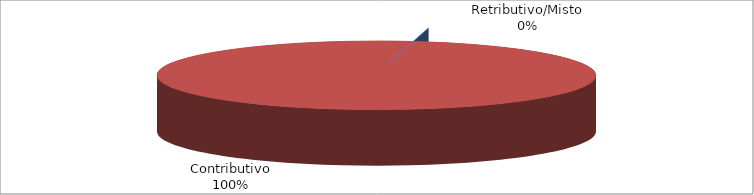
| Category | Series 1 |
|---|---|
| Retributivo/Misto | 0 |
| Contributivo | 42425 |